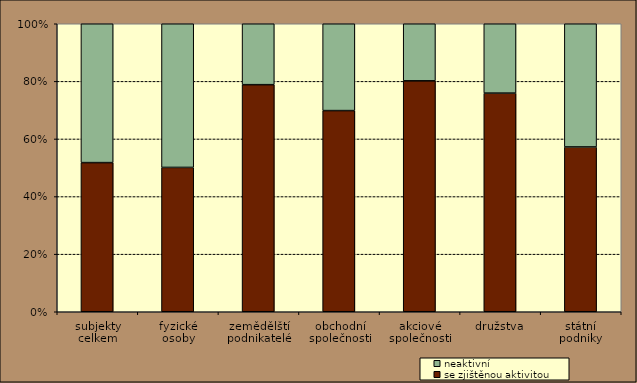
| Category | se zjištěnou aktivitou | neaktivní |
|---|---|---|
| subjekty
celkem | 51.786 | 48.214 |
| fyzické
osoby | 50.116 | 49.884 |
| zemědělští podnikatelé | 78.848 | 21.152 |
| obchodní
společnosti | 69.849 | 30.151 |
| akciové
společnosti | 80.185 | 19.815 |
| družstva | 75.92 | 24.08 |
| státní
podniky | 57.222 | 42.778 |